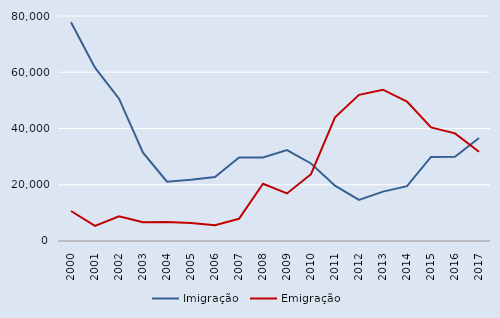
| Category | Imigração | Emigração |
|---|---|---|
| 2000.0 | 77775 | 10667 |
| 2001.0 | 61609 | 5396 |
| 2002.0 | 50611 | 8813 |
| 2003.0 | 31425 | 6687 |
| 2004.0 | 21093 | 6757 |
| 2005.0 | 21741 | 6360 |
| 2006.0 | 22741 | 5600 |
| 2007.0 | 29661 | 7890 |
| 2008.0 | 29718 | 20357 |
| 2009.0 | 32307 | 16899 |
| 2010.0 | 27575 | 23760 |
| 2011.0 | 19667 | 43998 |
| 2012.0 | 14606 | 51958 |
| 2013.0 | 17554 | 53786 |
| 2014.0 | 19516 | 49572 |
| 2015.0 | 29896 | 40377 |
| 2016.0 | 29925 | 38273 |
| 2017.0 | 36639 | 31753 |